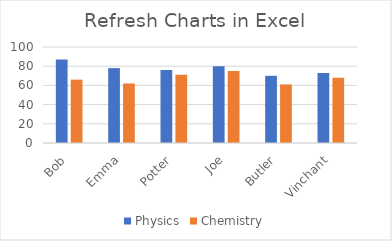
| Category | Physics | Chemistry |
|---|---|---|
| Bob | 87 | 66 |
| Emma | 78 | 62 |
| Potter | 76 | 71 |
| Joe | 80 | 75 |
| Butler | 70 | 61 |
| Vinchant | 73 | 68 |